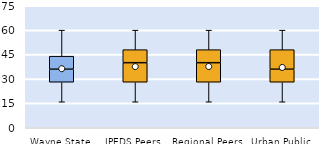
| Category | 25th | 50th | 75th |
|---|---|---|---|
| Wayne State | 28 | 8 | 8 |
| IPEDS Peers | 28 | 12 | 8 |
| Regional Peers | 28 | 12 | 8 |
| Urban Public | 28 | 8 | 12 |